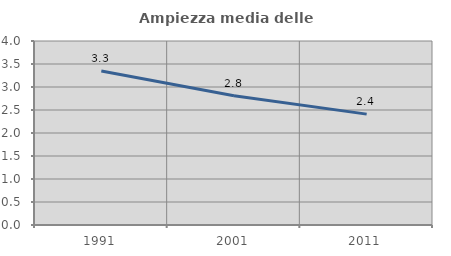
| Category | Ampiezza media delle famiglie |
|---|---|
| 1991.0 | 3.348 |
| 2001.0 | 2.808 |
| 2011.0 | 2.41 |